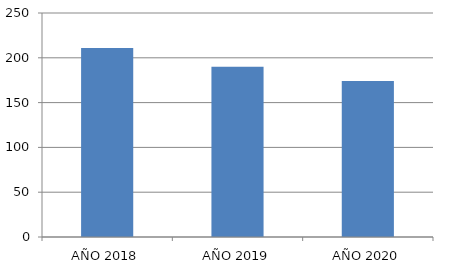
| Category | Series 0 |
|---|---|
| AÑO 2018 | 211 |
| AÑO 2019 | 190 |
| AÑO 2020 | 174 |